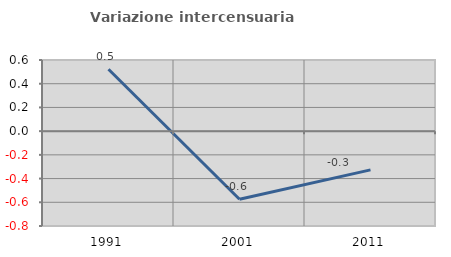
| Category | Variazione intercensuaria annua |
|---|---|
| 1991.0 | 0.522 |
| 2001.0 | -0.575 |
| 2011.0 | -0.327 |